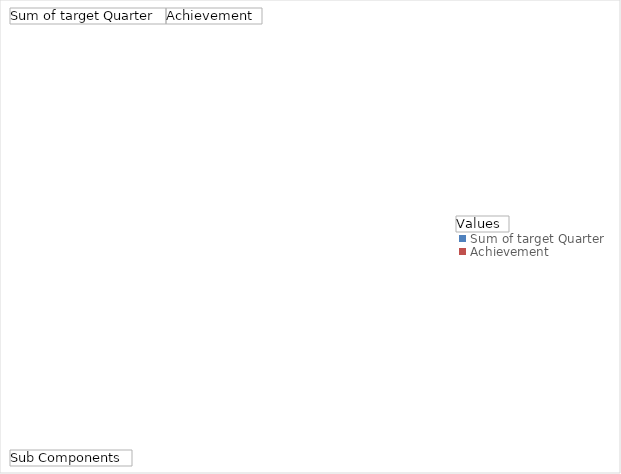
| Category | Sum of target Quarter | Achievement |
|---|---|---|
| WP/03
Kandalama Madurupitiya Rd 4.80km
Muruthana Bambukuliya Rd 3.40km
Adiambalama Kithulpitiya Rd 2.00km | 0.7 | 0.15 |
| NWP/03
Maho Nagollagama Rd 10.00km
Maspotha Thisnapola Rd 4.20km | 0.7 | 0.72 |
| NCP/03
Dambuluhalmillewa Galkiriyagama Rd 11.00km
Negama Halmillewa Rd 5.00km
Rathmale Nachchaduwa Rd 3.00km
Alisthna Thuruwila Rd 2.80km | 0.7 | 0.3 |
| UV/03
Ambagasdowa Dangamuwa Rd 4.44km
Nugathalawa Jayasooriya Rd 5.03km | 0.7 | 0.3 |
| EP/04
Hensman Rd 6.00km
Thumpankerney Thikkodai Rd 7.00km
Police Station Eruvil Rd 1.44km
Vavuvathivu Karaveddi Rd 2.00km | 0.7 | 0.25 |
| CP/03
Hettipola Town Rd 1.20km
Hattota Amuna Colony Rd 2.20km
Siyambalagaswewa (Nagolla -Welipitiya) Rd 4.00km
Sigiriya Pidurangala Awudawela Rd 4.00km | 0.7 | 0.1 |
| NP/03R
Pallamadhu Vidathalthivu Rd 1.77km
Thiruketheswaram Rd 1.34km
Puthukkuduyirippu Rd 1.80km
Coolyshed rd 0.80km
Erukkalampitty Amaipadukkai Rd 1.75km
Nanattan Periyapulaveli Potkerney Rd 2.74km
Nedunkandal Sornapuri Karukkakulam Rd 1.20km | 0.6 | 0.45 |
| SP/03R
Narawela Poddala Rd 3.90km
Ulukvitike Karapitiya Rd 0.56km
Ukwaththa Piyadigama Rd 2.56km | 0.6 | 0 |
| EP/03R
LB Chanel Rd 8.50km | 0.6 | 0 |
| UV/05R
Ella Halpe Rd 2.17km
Bindunuwewa Badulugasthenna Rd 2.43km
Dikulpotha Kirioruwa Rd 3.10km
Marangahawel Kosgama Rd 3.50km  | 0.6 | 0 |